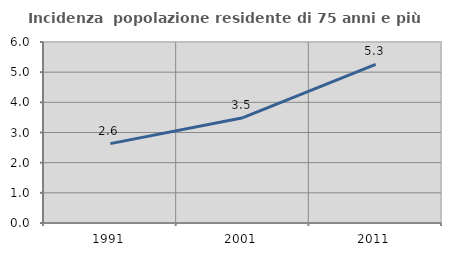
| Category | Incidenza  popolazione residente di 75 anni e più |
|---|---|
| 1991.0 | 2.631 |
| 2001.0 | 3.492 |
| 2011.0 | 5.259 |